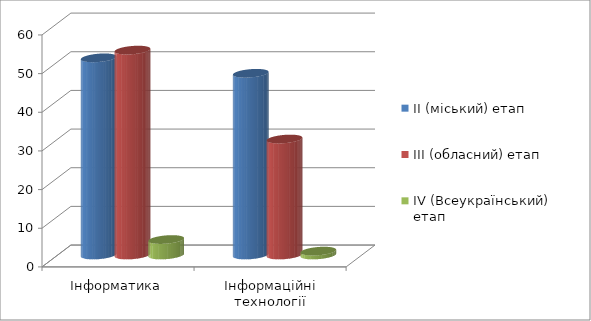
| Category | ІІ (міський) етап | ІІІ (обласний) етап | ІV (Всеукраїнський) етап |
|---|---|---|---|
| Інформатика | 51 | 53 | 4 |
| Інформаційні технології | 47 | 30 | 1 |